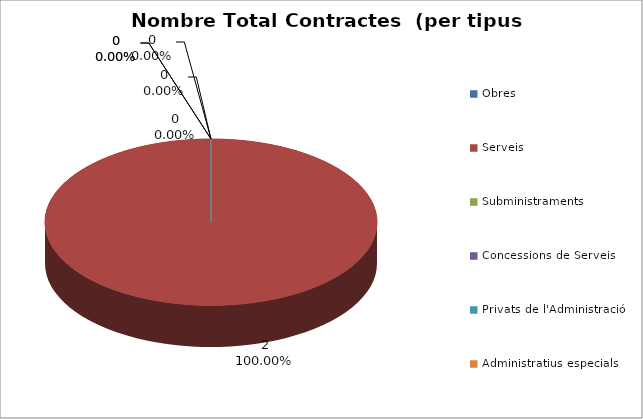
| Category | Nombre Total Contractes |
|---|---|
| Obres | 0 |
| Serveis | 2 |
| Subministraments | 0 |
| Concessions de Serveis | 0 |
| Privats de l'Administració | 0 |
| Administratius especials | 0 |